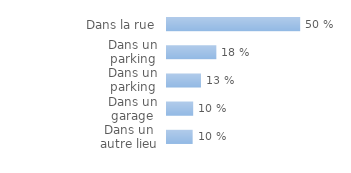
| Category | Ensemble des ménages victimes |
|---|---|
| Dans un autre lieu | 0.096 |
| Dans un garage | 0.098 |
| Dans un parking fermé | 0.127 |
| Dans un parking ouvert | 0.184 |
| Dans la rue | 0.496 |